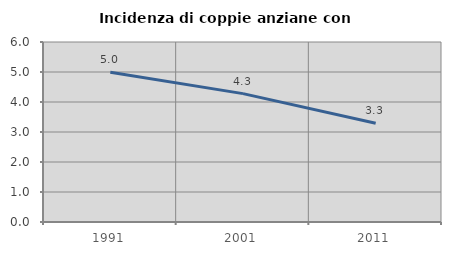
| Category | Incidenza di coppie anziane con figli |
|---|---|
| 1991.0 | 4.99 |
| 2001.0 | 4.28 |
| 2011.0 | 3.292 |